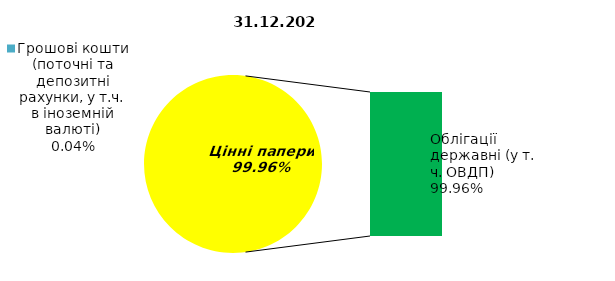
| Category | Series 0 |
|---|---|
| Грошові кошти (поточні та депозитні рахунки, у т.ч. в іноземній валюті) | 0.054 |
| Банківські метали | 0 |
| Нерухомість | 0 |
| Інші активи | 0 |
| Акції | 0 |
| Корпоративні облігації  | 0 |
| Облігації місцевих позик | 0 |
| Облігації державні (у т. ч. ОВДП) | 134.946 |
| Іпотечні сертифікати | 0 |